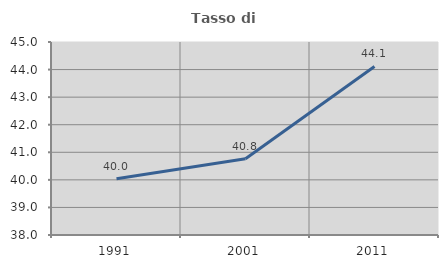
| Category | Tasso di occupazione   |
|---|---|
| 1991.0 | 40.039 |
| 2001.0 | 40.764 |
| 2011.0 | 44.112 |